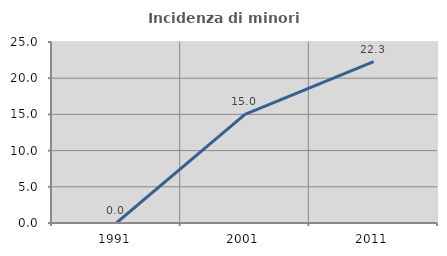
| Category | Incidenza di minori stranieri |
|---|---|
| 1991.0 | 0 |
| 2001.0 | 15 |
| 2011.0 | 22.289 |